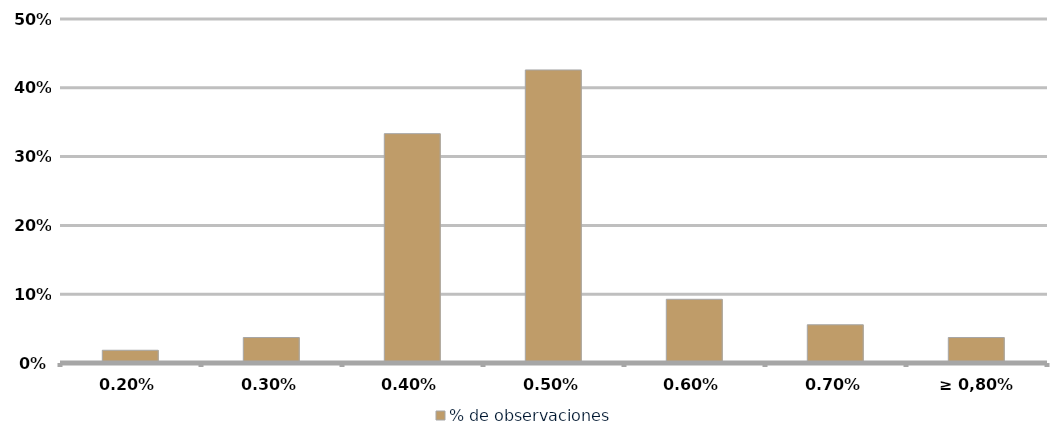
| Category | % de observaciones  |
|---|---|
| 0,20% | 0.019 |
| 0,30% | 0.037 |
| 0,40% | 0.333 |
| 0,50% | 0.426 |
| 0,60% | 0.093 |
| 0,70% | 0.056 |
| ≥ 0,80% | 0.037 |